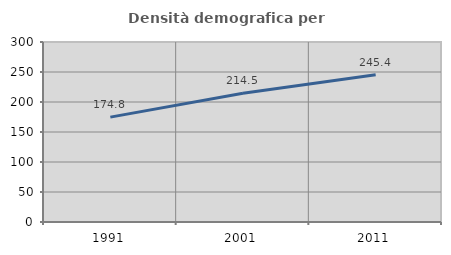
| Category | Densità demografica |
|---|---|
| 1991.0 | 174.765 |
| 2001.0 | 214.522 |
| 2011.0 | 245.445 |